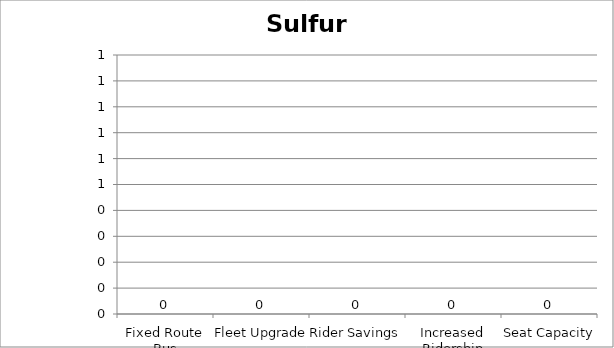
| Category | Sulfur Oxides |
|---|---|
| Fixed Route Bus | 0 |
| Fleet Upgrade | 0 |
| Rider Savings | 0 |
| Increased Ridership | 0 |
| Seat Capacity | 0 |